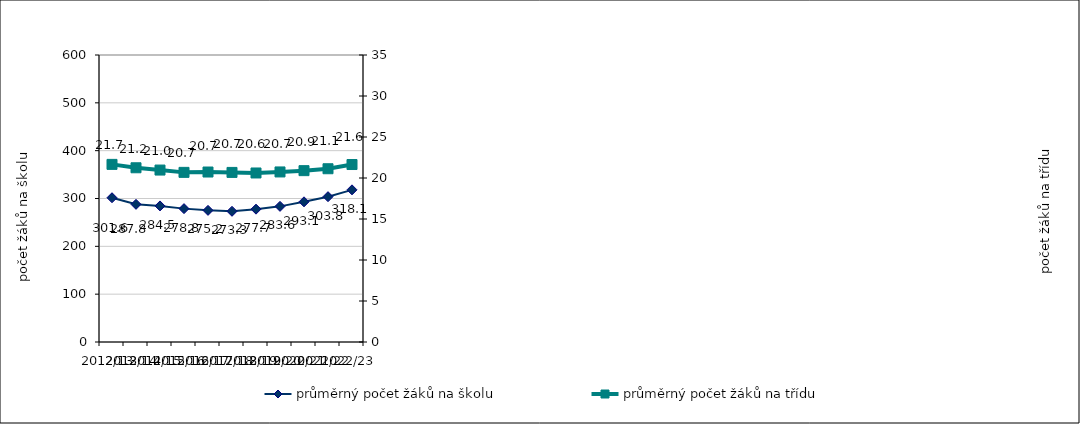
| Category | průměrný počet žáků na školu |
|---|---|
| 2012/13 | 301.573 |
| 2013/14 | 287.804 |
| 2014/15 | 284.474 |
| 2015/16 | 278.824 |
| 2016/17 | 275.191 |
| 2017/18 | 273.264 |
| 2018/19 | 277.701 |
| 2019/20 | 283.562 |
| 2020/21 | 293.075 |
| 2021/22 | 303.796 |
| 2022/23 | 318.111 |